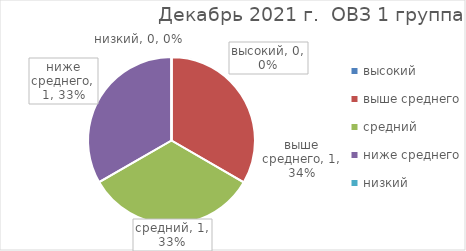
| Category | Series 0 |
|---|---|
| высокий | 0 |
| выше среднего | 1 |
| средний | 1 |
| ниже среднего | 1 |
| низкий | 0 |